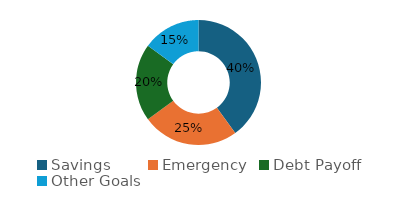
| Category | Series 0 |
|---|---|
| Savings | 0.4 |
| Emergency | 0.25 |
| Debt Payoff | 0.2 |
| Other Goals | 0.15 |